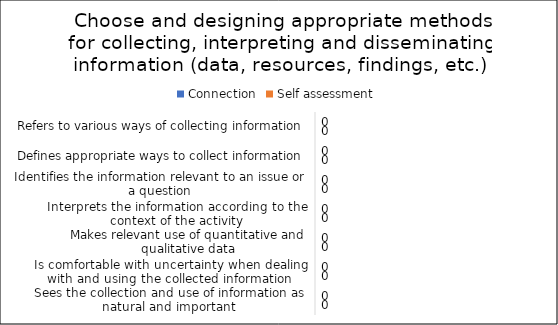
| Category | Connection | Self assessment |
|---|---|---|
| Refers to various ways of collecting information | 0 | 0 |
| Defines appropriate ways to collect information | 0 | 0 |
| Identifies the information relevant to an issue or a question | 0 | 0 |
| Interprets the information according to the context of the activity | 0 | 0 |
| Makes relevant use of quantitative and qualitative data | 0 | 0 |
| Is comfortable with uncertainty when dealing with and using the collected information  | 0 | 0 |
| Sees the collection and use of information as natural and important  | 0 | 0 |